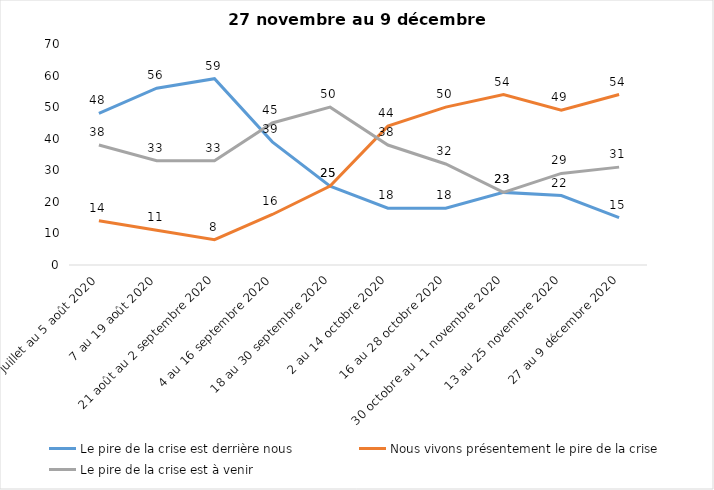
| Category | Le pire de la crise est derrière nous | Nous vivons présentement le pire de la crise | Le pire de la crise est à venir |
|---|---|---|---|
| 24 juillet au 5 août 2020 | 48 | 14 | 38 |
| 7 au 19 août 2020 | 56 | 11 | 33 |
| 21 août au 2 septembre 2020 | 59 | 8 | 33 |
| 4 au 16 septembre 2020 | 39 | 16 | 45 |
| 18 au 30 septembre 2020 | 25 | 25 | 50 |
| 2 au 14 octobre 2020 | 18 | 44 | 38 |
| 16 au 28 octobre 2020 | 18 | 50 | 32 |
| 30 octobre au 11 novembre 2020 | 23 | 54 | 23 |
| 13 au 25 novembre 2020 | 22 | 49 | 29 |
| 27 au 9 décembre 2020 | 15 | 54 | 31 |